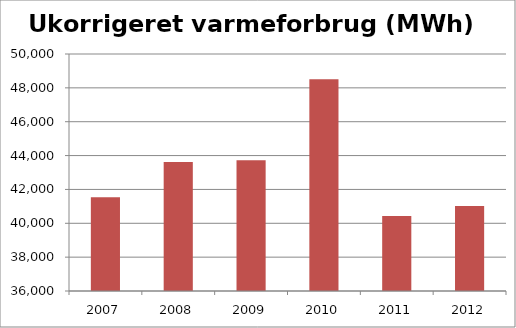
| Category | Ukorrigeret varmeforbrug (MWh) |
|---|---|
| 2007.0 | 41545.025 |
| 2008.0 | 43626.637 |
| 2009.0 | 43716.919 |
| 2010.0 | 48513.631 |
| 2011.0 | 40433.133 |
| 2012.0 | 41021.303 |